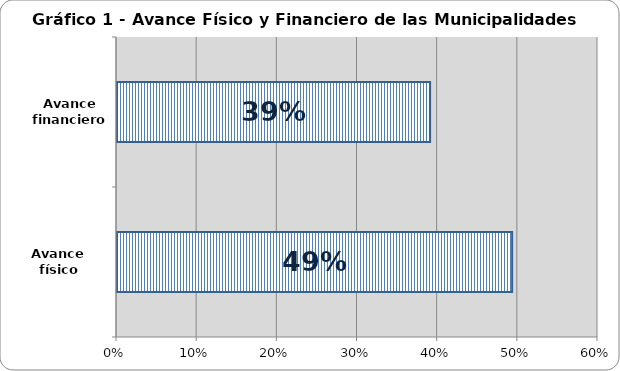
| Category | Series 0 |
|---|---|
| Avance físico | 0.493 |
| Avance financiero | 0.391 |